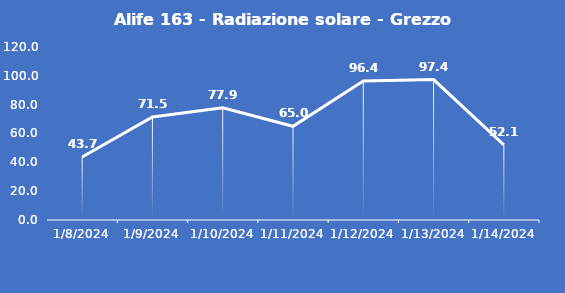
| Category | Alife 163 - Radiazione solare - Grezzo (W/m2) |
|---|---|
| 1/8/24 | 43.7 |
| 1/9/24 | 71.5 |
| 1/10/24 | 77.9 |
| 1/11/24 | 65 |
| 1/12/24 | 96.4 |
| 1/13/24 | 97.4 |
| 1/14/24 | 52.1 |